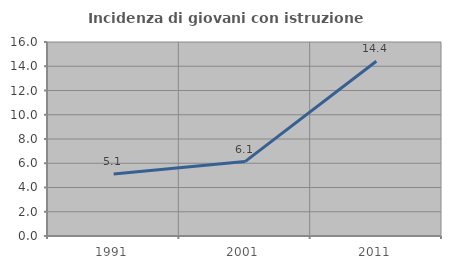
| Category | Incidenza di giovani con istruzione universitaria |
|---|---|
| 1991.0 | 5.114 |
| 2001.0 | 6.135 |
| 2011.0 | 14.414 |